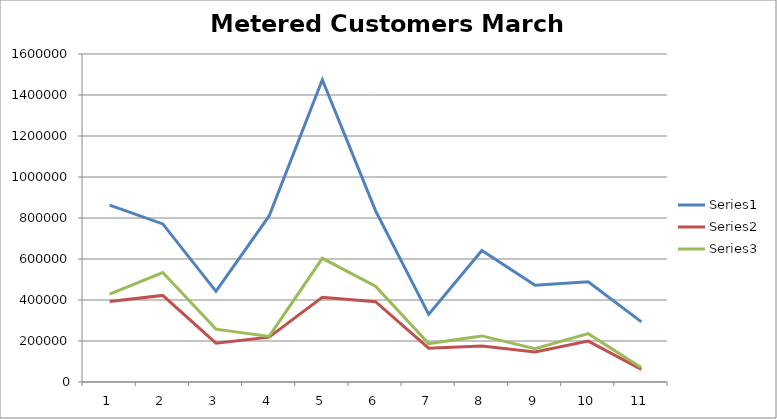
| Category | Series 0 | Series 1 | Series 2 |
|---|---|---|---|
| 0 | 862696 | 392488 | 428920 |
| 1 | 771226 | 422308 | 534213 |
| 2 | 442201 | 189542 | 257813 |
| 3 | 809829 | 218718 | 222444 |
| 4 | 1474364 | 413170 | 603400 |
| 5 | 835736 | 391724 | 467578 |
| 6 | 329858 | 165046 | 187415 |
| 7 | 641582 | 175275 | 224844 |
| 8 | 472453 | 146329 | 162664 |
| 9 | 488600 | 199501 | 235806 |
| 10 | 293478 | 61599 | 69282 |